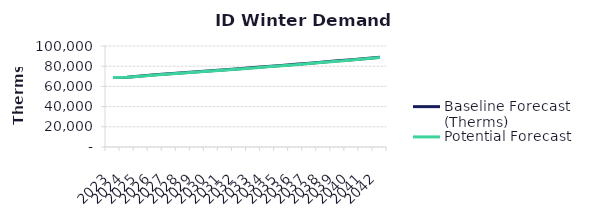
| Category | Baseline Forecast (Therms) | Potential Forecast |
|---|---|---|
| 2023.0 | 68769.61 | 68769.61 |
| 2024.0 | 69092.602 | 68950.868 |
| 2025.0 | 70262.85 | 70033.271 |
| 2026.0 | 71550.101 | 71259.623 |
| 2027.0 | 72508.988 | 72215.027 |
| 2028.0 | 73483.538 | 73186.053 |
| 2029.0 | 74474.024 | 74172.971 |
| 2030.0 | 75480.723 | 75176.059 |
| 2031.0 | 76503.918 | 76195.597 |
| 2032.0 | 77543.895 | 77231.872 |
| 2033.0 | 78600.947 | 78285.176 |
| 2034.0 | 79675.369 | 79355.806 |
| 2035.0 | 80767.467 | 80444.062 |
| 2036.0 | 81877.546 | 81550.253 |
| 2037.0 | 83005.92 | 82674.691 |
| 2038.0 | 84152.909 | 83817.695 |
| 2039.0 | 85318.836 | 84979.588 |
| 2040.0 | 86504.032 | 86160.7 |
| 2041.0 | 87708.833 | 87361.366 |
| 2042.0 | 88933.582 | 88581.928 |